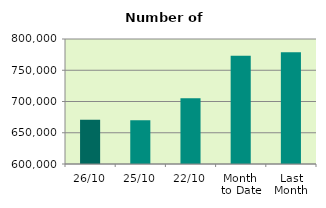
| Category | Series 0 |
|---|---|
| 26/10 | 670978 |
| 25/10 | 670198 |
| 22/10 | 705032 |
| Month 
to Date | 773209.667 |
| Last
Month | 778605.273 |